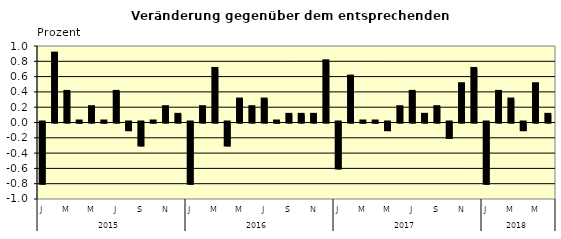
| Category | Series 0 |
|---|---|
| 0 | -0.8 |
| 1 | 0.9 |
| 2 | 0.4 |
| 3 | 0.01 |
| 4 | 0.2 |
| 5 | 0.01 |
| 6 | 0.4 |
| 7 | -0.1 |
| 8 | -0.3 |
| 9 | 0.01 |
| 10 | 0.2 |
| 11 | 0.1 |
| 12 | -0.8 |
| 13 | 0.2 |
| 14 | 0.7 |
| 15 | -0.3 |
| 16 | 0.3 |
| 17 | 0.2 |
| 18 | 0.3 |
| 19 | 0.01 |
| 20 | 0.1 |
| 21 | 0.1 |
| 22 | 0.1 |
| 23 | 0.8 |
| 24 | -0.6 |
| 25 | 0.6 |
| 26 | 0.01 |
| 27 | 0.01 |
| 28 | -0.1 |
| 29 | 0.2 |
| 30 | 0.4 |
| 31 | 0.1 |
| 32 | 0.2 |
| 33 | -0.2 |
| 34 | 0.5 |
| 35 | 0.7 |
| 36 | -0.8 |
| 37 | 0.4 |
| 38 | 0.3 |
| 39 | -0.1 |
| 40 | 0.5 |
| 41 | 0.1 |